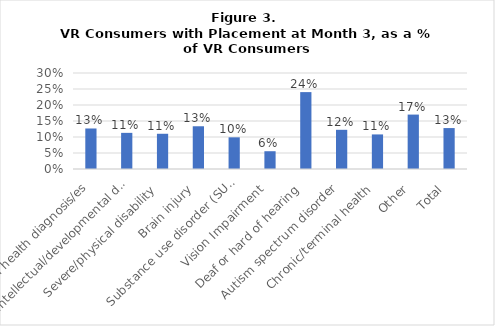
| Category | VR Consumers with 3 Mos. Placement as a % of VR Consumers |
|---|---|
| Mental health diagnosis/es | 0.127 |
| Intellectual/developmental disability  | 0.113 |
| Severe/physical disability  | 0.11 |
| Brain injury  | 0.134 |
| Substance use disorder (SUD)  | 0.099 |
| Vision Impairment  | 0.056 |
| Deaf or hard of hearing  | 0.24 |
| Autism spectrum disorder  | 0.122 |
| Chronic/terminal health  | 0.108 |
| Other  | 0.17 |
| Total  | 0.128 |